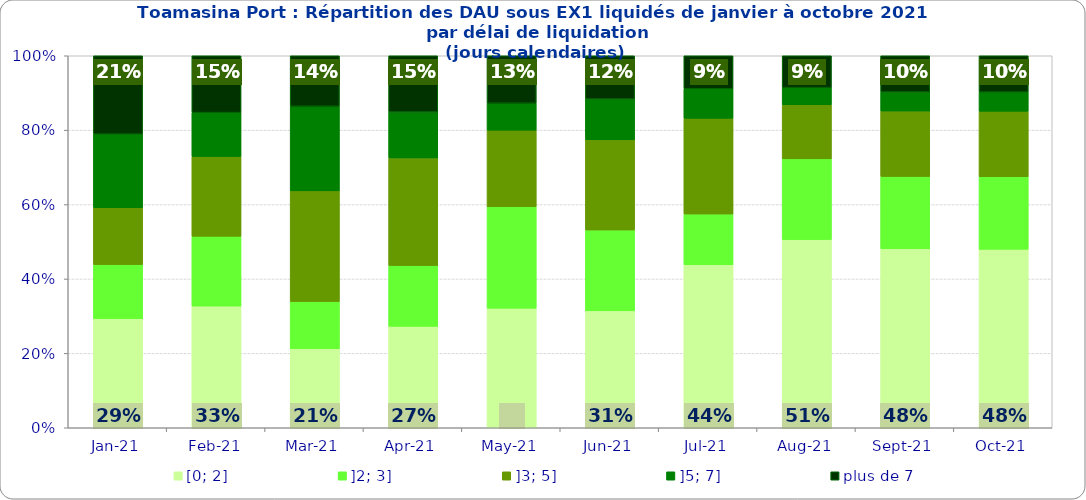
| Category | [0; 2] | ]2; 3] | ]3; 5] | ]5; 7] | plus de 7 |
|---|---|---|---|---|---|
| 2021-01-01 | 0.293 | 0.145 | 0.153 | 0.198 | 0.211 |
| 2021-02-01 | 0.327 | 0.188 | 0.214 | 0.118 | 0.153 |
| 2021-03-01 | 0.212 | 0.127 | 0.298 | 0.228 | 0.136 |
| 2021-04-01 | 0.273 | 0.164 | 0.289 | 0.124 | 0.151 |
| 2021-05-01 | 0.322 | 0.273 | 0.206 | 0.073 | 0.127 |
| 2021-06-01 | 0.314 | 0.217 | 0.243 | 0.11 | 0.116 |
| 2021-07-01 | 0.438 | 0.137 | 0.257 | 0.079 | 0.089 |
| 2021-08-01 | 0.506 | 0.217 | 0.146 | 0.046 | 0.086 |
| 2021-09-01 | 0.481 | 0.195 | 0.176 | 0.051 | 0.097 |
| 2021-10-01 | 0.48 | 0.195 | 0.176 | 0.051 | 0.098 |